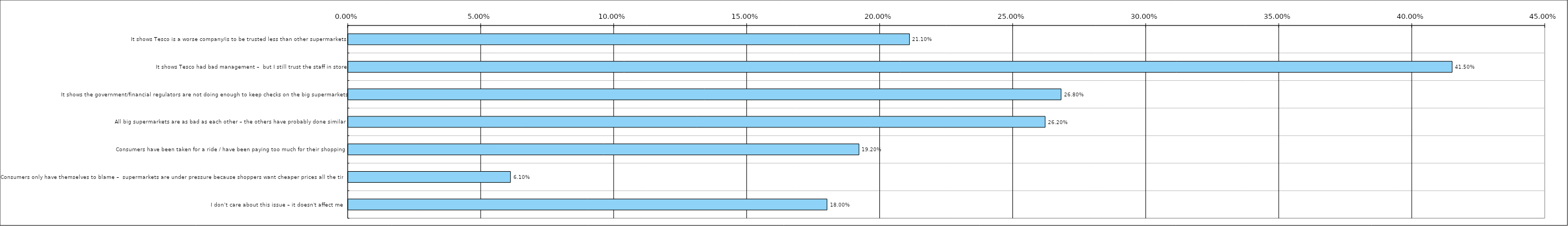
| Category | Total(United Kingdom) |
|---|---|
| It shows Tesco is a worse company/is to be trusted less than other supermarkets | 0.211 |
| It shows Tesco had bad management –  but I still trust the staff in store | 0.415 |
| It shows the government/financial regulators are not doing enough to keep checks on the big supermarkets | 0.268 |
| All big supermarkets are as bad as each other – the others have probably done similar  | 0.262 |
| Consumers have been taken for a ride / have been paying too much for their shopping | 0.192 |
| Consumers only have themselves to blame –  supermarkets are under pressure because shoppers want cheaper prices all the time | 0.061 |
| I don’t care about this issue – it doesn't affect me  | 0.18 |